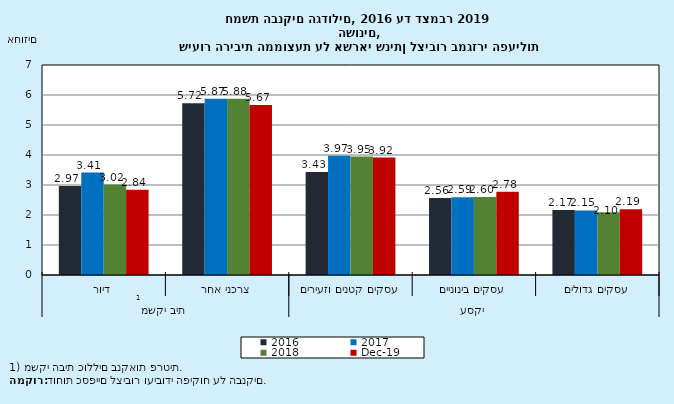
| Category | 2016 | 2017 | 2018 | דצמ-19 |
|---|---|---|---|---|
| 0 | 2.97 | 3.413 | 3.016 | 2.839 |
| 1 | 5.724 | 5.873 | 5.877 | 5.666 |
| 2 | 3.431 | 3.972 | 3.946 | 3.916 |
| 3 | 2.565 | 2.591 | 2.601 | 2.778 |
| 4 | 2.166 | 2.151 | 2.096 | 2.192 |